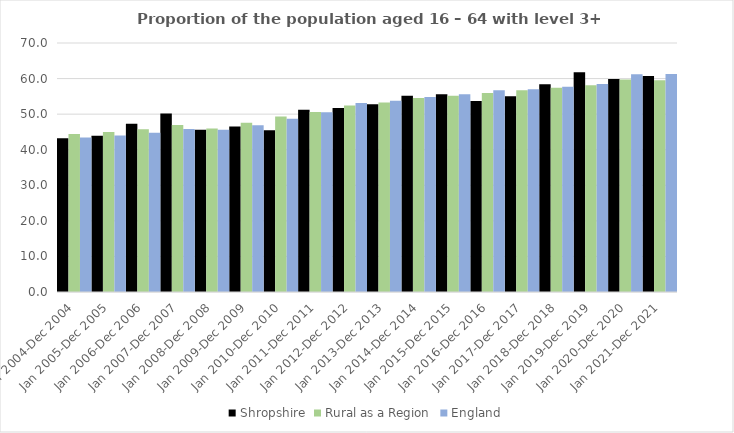
| Category | Shropshire | Rural as a Region | England |
|---|---|---|---|
| Jan 2004-Dec 2004 | 43.2 | 44.405 | 43.4 |
| Jan 2005-Dec 2005 | 43.9 | 44.973 | 44 |
| Jan 2006-Dec 2006 | 47.3 | 45.774 | 44.8 |
| Jan 2007-Dec 2007 | 50.2 | 46.968 | 45.8 |
| Jan 2008-Dec 2008 | 45.6 | 45.964 | 45.6 |
| Jan 2009-Dec 2009 | 46.5 | 47.59 | 46.9 |
| Jan 2010-Dec 2010 | 45.5 | 49.362 | 48.7 |
| Jan 2011-Dec 2011 | 51.2 | 50.602 | 50.5 |
| Jan 2012-Dec 2012 | 51.7 | 52.439 | 53.1 |
| Jan 2013-Dec 2013 | 52.8 | 53.276 | 53.8 |
| Jan 2014-Dec 2014 | 55.2 | 54.57 | 54.8 |
| Jan 2015-Dec 2015 | 55.6 | 55.16 | 55.6 |
| Jan 2016-Dec 2016 | 53.7 | 55.941 | 56.7 |
| Jan 2017-Dec 2017 | 55 | 56.689 | 57 |
| Jan 2018-Dec 2018 | 58.4 | 57.389 | 57.7 |
| Jan 2019-Dec 2019 | 61.8 | 58.147 | 58.5 |
| Jan 2020-Dec 2020 | 59.9 | 59.771 | 61.2 |
| Jan 2021-Dec 2021 | 60.7 | 59.54 | 61.3 |